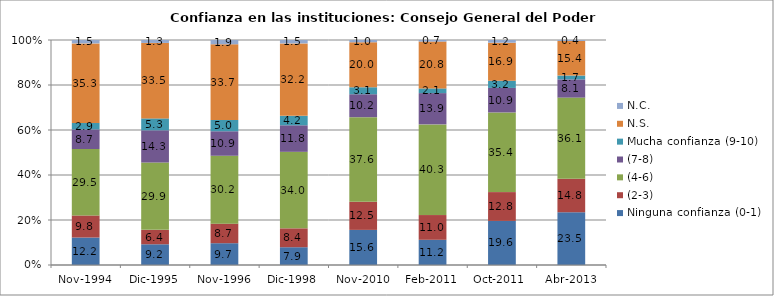
| Category | Ninguna confianza (0-1) | (2-3) | (4-6) | (7-8) | Mucha confianza (9-10) | N.S. | N.C. |
|---|---|---|---|---|---|---|---|
| Nov-1994 | 12.2 | 9.8 | 29.5 | 8.7 | 2.9 | 35.3 | 1.5 |
| Dic-1995 | 9.2 | 6.4 | 29.9 | 14.3 | 5.3 | 33.5 | 1.3 |
| Nov-1996 | 9.7 | 8.7 | 30.2 | 10.9 | 5 | 33.7 | 1.9 |
| Dic-1998 | 7.9 | 8.4 | 34 | 11.8 | 4.2 | 32.2 | 1.5 |
| Nov-2010 | 15.6 | 12.5 | 37.6 | 10.2 | 3.1 | 20 | 1 |
| Feb-2011 | 11.2 | 11 | 40.3 | 13.9 | 2.1 | 20.8 | 0.7 |
| Oct-2011  | 19.6 | 12.8 | 35.4 | 10.9 | 3.2 | 16.9 | 1.2 |
| Abr-2013 | 23.5 | 14.8 | 36.1 | 8.1 | 1.7 | 15.4 | 0.4 |